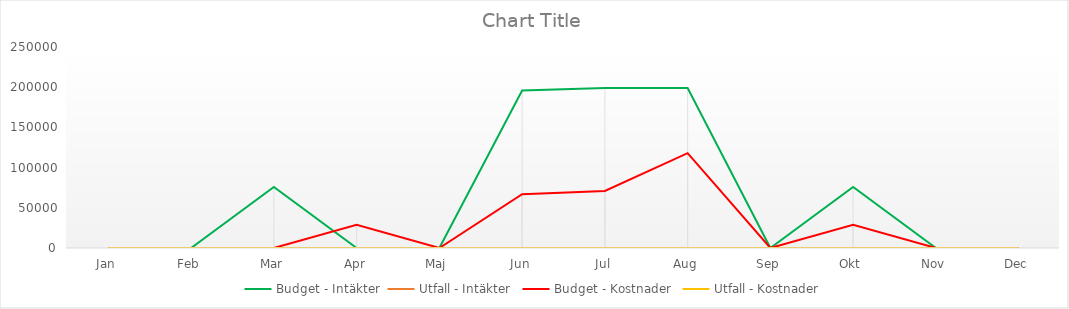
| Category | Budget - Intäkter | Utfall - Intäkter  | Budget - Kostnader  | Utfall - Kostnader |
|---|---|---|---|---|
| Jan | 0 | 0 | 0 | 0 |
| Feb | 0 | 0 | 0 | 0 |
| Mar | 76000 | 0 | 0 | 0 |
| Apr | 0 | 0 | 29000 | 0 |
| Maj | 0 | 0 | 0 | 0 |
| Jun | 196000 | 0 | 67000 | 0 |
| Jul | 199000 | 0 | 71000 | 0 |
| Aug | 199000 | 0 | 118000 | 0 |
| Sep | 0 | 0 | 0 | 0 |
| Okt | 76000 | 0 | 29000 | 0 |
| Nov | 0 | 0 | 0 | 0 |
| Dec | 0 | 0 | 0 | 0 |